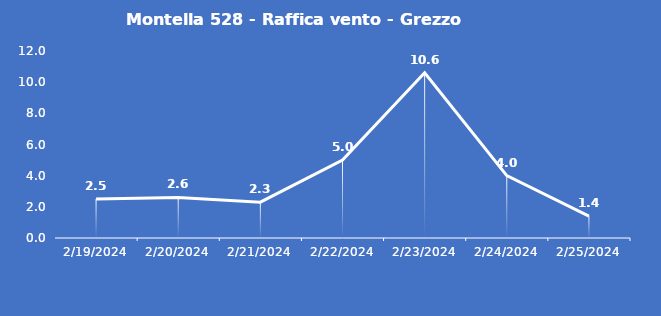
| Category | Montella 528 - Raffica vento - Grezzo (m/s) |
|---|---|
| 2/19/24 | 2.5 |
| 2/20/24 | 2.6 |
| 2/21/24 | 2.3 |
| 2/22/24 | 5 |
| 2/23/24 | 10.6 |
| 2/24/24 | 4 |
| 2/25/24 | 1.4 |